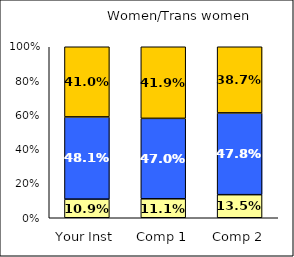
| Category | Low Student-Centered Pedagogy | Average Student-Centered Pedagogy | High Student-Centered Pedagogy |
|---|---|---|---|
| Your Inst | 0.109 | 0.481 | 0.41 |
| Comp 1 | 0.111 | 0.47 | 0.419 |
| Comp 2 | 0.135 | 0.478 | 0.387 |